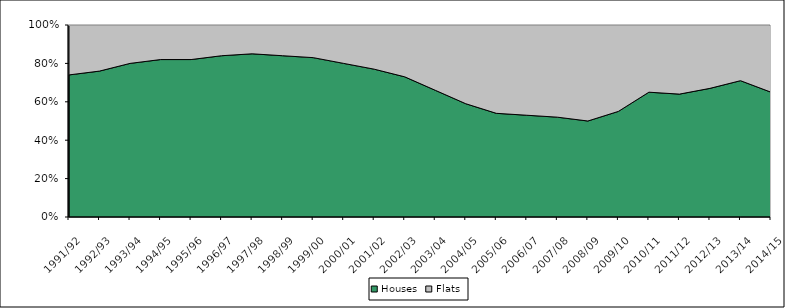
| Category | Houses | Flats |
|---|---|---|
| 1991/92 | 74 | 26 |
| 1992/93 | 76 | 24 |
| 1993/94 | 80 | 20 |
| 1994/95 | 82 | 18 |
| 1995/96 | 82 | 18 |
| 1996/97 | 84 | 16 |
| 1997/98 | 85 | 15 |
| 1998/99 | 84 | 16 |
| 1999/00 | 83 | 17 |
| 2000/01 | 80 | 20 |
| 2001/02 | 77 | 23 |
| 2002/03 | 73 | 27 |
| 2003/04 | 66 | 34 |
| 2004/05 | 59 | 41 |
| 2005/06 | 54 | 46 |
| 2006/07 | 53 | 47 |
| 2007/08 | 52 | 48 |
| 2008/09 | 50 | 50 |
| 2009/10 | 55 | 45 |
| 2010/11 | 65 | 35 |
| 2011/12 | 64 | 36 |
| 2012/13 | 67 | 33 |
| 2013/14 | 71 | 29 |
| 2014/15 | 65 | 35 |